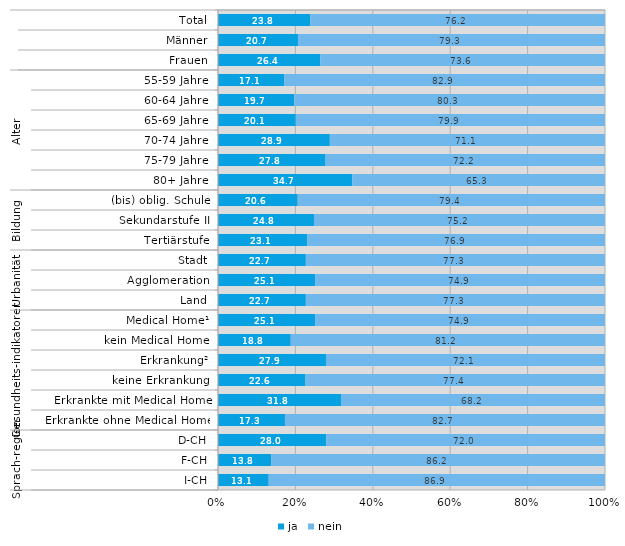
| Category | ja | nein |
|---|---|---|
| 0 | 23.8 | 76.2 |
| 1 | 20.7 | 79.3 |
| 2 | 26.4 | 73.6 |
| 3 | 17.1 | 82.9 |
| 4 | 19.7 | 80.3 |
| 5 | 20.1 | 79.9 |
| 6 | 28.9 | 71.1 |
| 7 | 27.8 | 72.2 |
| 8 | 34.7 | 65.3 |
| 9 | 20.6 | 79.4 |
| 10 | 24.8 | 75.2 |
| 11 | 23.1 | 76.9 |
| 12 | 22.7 | 77.3 |
| 13 | 25.1 | 74.9 |
| 14 | 22.7 | 77.3 |
| 15 | 25.1 | 74.9 |
| 16 | 18.8 | 81.2 |
| 17 | 27.9 | 72.1 |
| 18 | 22.6 | 77.4 |
| 19 | 31.8 | 68.2 |
| 20 | 17.3 | 82.7 |
| 21 | 28 | 72 |
| 22 | 13.8 | 86.2 |
| 23 | 13.1 | 86.9 |